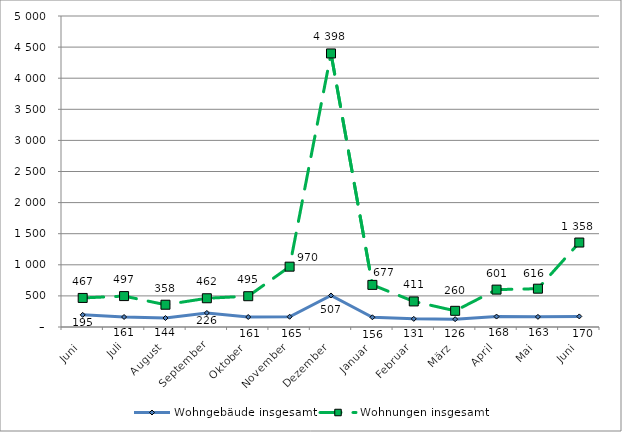
| Category | Wohngebäude insgesamt | Wohnungen insgesamt |
|---|---|---|
| Juni | 195 | 467 |
| Juli | 161 | 497 |
| August | 144 | 358 |
| September | 226 | 462 |
| Oktober | 161 | 495 |
| November | 165 | 970 |
| Dezember | 507 | 4398 |
| Januar | 156 | 677 |
| Februar | 131 | 411 |
| März | 126 | 260 |
| April | 168 | 601 |
| Mai | 163 | 616 |
| Juni | 170 | 1358 |